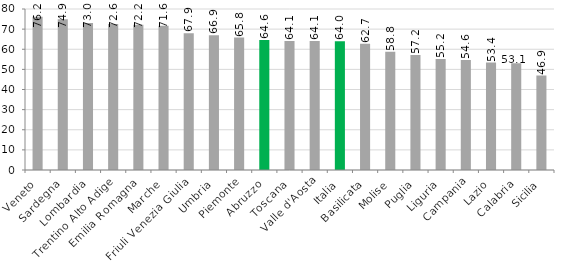
| Category | 2021 |
|---|---|
| Veneto | 76.18 |
| Sardegna | 74.88 |
| Lombardia | 73.04 |
| Trentino Alto Adige | 72.58 |
| Emilia Romagna | 72.22 |
| Marche | 71.62 |
| Friuli Venezia Giulia | 67.94 |
| Umbria | 66.94 |
| Piemonte | 65.78 |
| Abruzzo | 64.63 |
| Toscana | 64.13 |
| Valle d'Aosta | 64.05 |
| Italia | 64 |
| Basilicata | 62.74 |
| Molise | 58.8 |
| Puglia | 57.18 |
| Liguria | 55.2 |
| Campania | 54.64 |
| Lazio | 53.41 |
| Calabria | 53.05 |
| Sicilia | 46.93 |